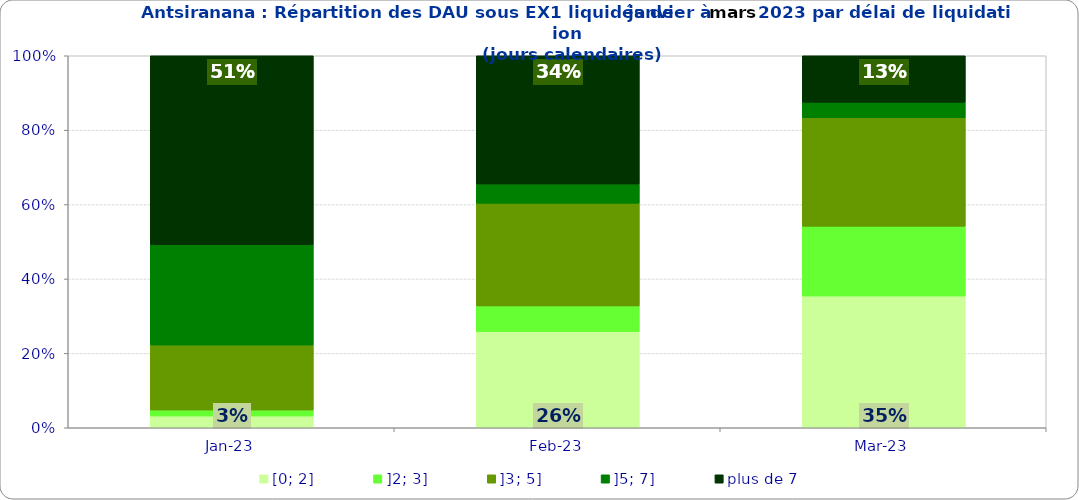
| Category | [0; 2] | ]2; 3] | ]3; 5] | ]5; 7] | plus de 7 |
|---|---|---|---|---|---|
| 2023-01-01 | 0.032 | 0.016 | 0.175 | 0.27 | 0.508 |
| 2023-02-01 | 0.259 | 0.069 | 0.276 | 0.052 | 0.345 |
| 2023-03-01 | 0.354 | 0.188 | 0.292 | 0.042 | 0.125 |